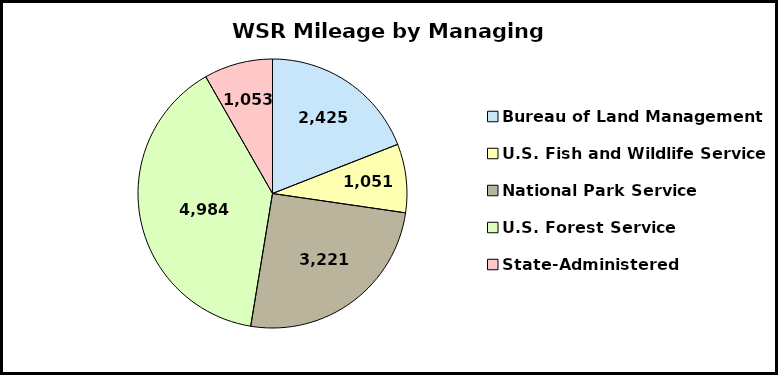
| Category | Series 0 |
|---|---|
| Bureau of Land Management | 2425.2 |
| U.S. Fish and Wildlife Service | 1051 |
| National Park Service | 3220.7 |
| U.S. Forest Service | 4984.1 |
| State-Administered | 1052.5 |